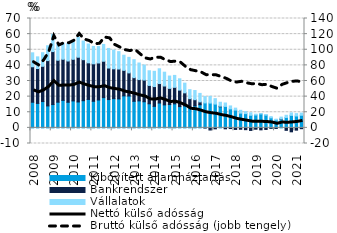
| Category | Kibővített államháztartás | Bankrendszer | Vállalatok |
|---|---|---|---|
| 2008.0 | 16.404 | 22.716 | 8.916 |
| 2008.0 | 15.651 | 22.33 | 7.473 |
| 2008.0 | 16.846 | 22.574 | 8.679 |
| 2008.0 | 14.047 | 29.01 | 9.502 |
| 2009.0 | 14.927 | 33.904 | 11.038 |
| 2009.0 | 16.435 | 26.85 | 10.53 |
| 2009.0 | 17.608 | 26.295 | 10.365 |
| 2009.0 | 16.398 | 26.403 | 11.301 |
| 2010.0 | 17.255 | 26.623 | 11.141 |
| 2010.0 | 16.586 | 28.619 | 12.8 |
| 2010.0 | 17.396 | 26.247 | 11.943 |
| 2010.0 | 18.186 | 23.436 | 12.044 |
| 2011.0 | 17.018 | 23.982 | 11.128 |
| 2011.0 | 17.848 | 23.686 | 10.523 |
| 2011.0 | 19.355 | 23.299 | 10.756 |
| 2011.0 | 18.123 | 20.182 | 12.535 |
| 2012.0 | 18.711 | 19.086 | 11.985 |
| 2012.0 | 18.542 | 19.118 | 11.122 |
| 2012.0 | 20.485 | 16.328 | 9.677 |
| 2012.0 | 20.399 | 14.794 | 9.937 |
| 2013.0 | 17.014 | 15.132 | 11.498 |
| 2013.0 | 17.267 | 13.644 | 10.603 |
| 2013.0 | 16.727 | 13.883 | 9.595 |
| 2013.0 | 15.423 | 11.741 | 9.384 |
| 2014.0 | 13.76 | 12.681 | 9.756 |
| 2014.0 | 15.888 | 12.483 | 9.449 |
| 2014.0 | 14.705 | 12.088 | 8.842 |
| 2014.0 | 14.922 | 10.372 | 7.872 |
| 2015.0 | 15.37 | 10.579 | 7.624 |
| 2015.0 | 13.624 | 10.549 | 7.235 |
| 2015.0 | 14.065 | 8.353 | 6.201 |
| 2015.0 | 12.996 | 5.69 | 5.765 |
| 2016.0 | 14.055 | 3.979 | 5.863 |
| 2016.0 | 14.798 | 1.823 | 5.445 |
| 2016.0 | 15.971 | -0.067 | 4.052 |
| 2016.0 | 15.867 | -1.368 | 4.315 |
| 2017.0 | 15.231 | -0.62 | 3.472 |
| 2017.0 | 13.528 | 0.345 | 2.53 |
| 2017.0 | 13.75 | -0.604 | 2.174 |
| 2017.0 | 12.159 | -0.428 | 1.882 |
| 2018.0 | 11.383 | -1 | 1.254 |
| 2018.0 | 9.434 | -0.888 | 1.804 |
| 2018.0 | 9.127 | -1.152 | 1.259 |
| 2018.0 | 8.072 | -1.636 | 1.565 |
| 2019.0 | 8.244 | -0.873 | 0.521 |
| 2019.0 | 8.912 | -1.26 | 0.111 |
| 2019.0 | 8.162 | -1.017 | 0.355 |
| 2019.0 | 6.424 | -0.295 | 0.768 |
| 2020.0 | 5.032 | -0.373 | 0.537 |
| 2020.0 | 5.588 | 0.138 | 1.176 |
| 2020.0 | 6.669 | -1.579 | 1.388 |
| 2020.0 | 8.014 | -2.525 | 1.546 |
| 2021.0 | 7.61 | -1.452 | 1.507 |
| 2021.0 | 8.068 | -0.523 | 1.398 |